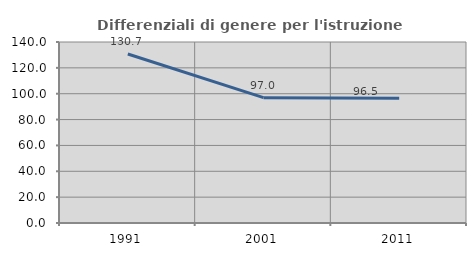
| Category | Differenziali di genere per l'istruzione superiore |
|---|---|
| 1991.0 | 130.716 |
| 2001.0 | 96.966 |
| 2011.0 | 96.498 |